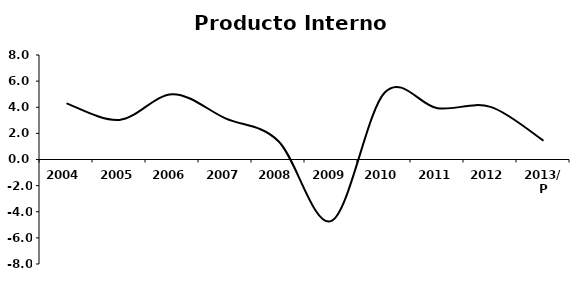
| Category | Series 0 |
|---|---|
| 2004 | 4.296 |
| 2005 | 3.033 |
| 2006 | 5.001 |
| 2007 | 3.148 |
| 2008 | 1.4 |
| 2009 | -4.7 |
| 2010 | 5.11 |
| 2011 | 3.925 |
| 2012 | 4.029 |
| 2013/P | 1.436 |